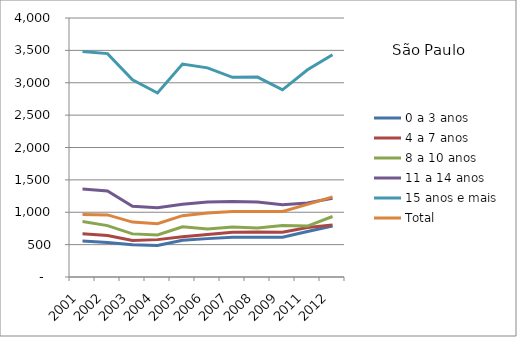
| Category | 0 a 3 anos | 4 a 7 anos | 8 a 10 anos | 11 a 14 anos | 15 anos e mais | Total |
|---|---|---|---|---|---|---|
| 2001.0 | 554.55 | 666.63 | 857.3 | 1360.8 | 3483.23 | 964.61 |
| 2002.0 | 530.97 | 640.97 | 793.42 | 1329.96 | 3450.23 | 958.58 |
| 2003.0 | 496.54 | 563.94 | 666 | 1093.97 | 3046.22 | 848.17 |
| 2004.0 | 486.91 | 577.22 | 648.73 | 1067.82 | 2842.26 | 823.71 |
| 2005.0 | 565.9 | 621.43 | 774.34 | 1123.26 | 3289.17 | 947.51 |
| 2006.0 | 592.69 | 656.6 | 741.16 | 1159.72 | 3230.23 | 988.18 |
| 2007.0 | 613.24 | 690.21 | 772.95 | 1167.8 | 3084.36 | 1013.28 |
| 2008.0 | 615.49 | 696.68 | 758.09 | 1159.95 | 3087.82 | 1011.52 |
| 2009.0 | 613.06 | 692.26 | 796.84 | 1116.46 | 2891.14 | 1010.89 |
| 2011.0 | 703.44 | 764.97 | 786.33 | 1142.45 | 3200.19 | 1121.53 |
| 2012.0 | 786.56 | 802.84 | 934.4 | 1215.98 | 3433.59 | 1237.14 |